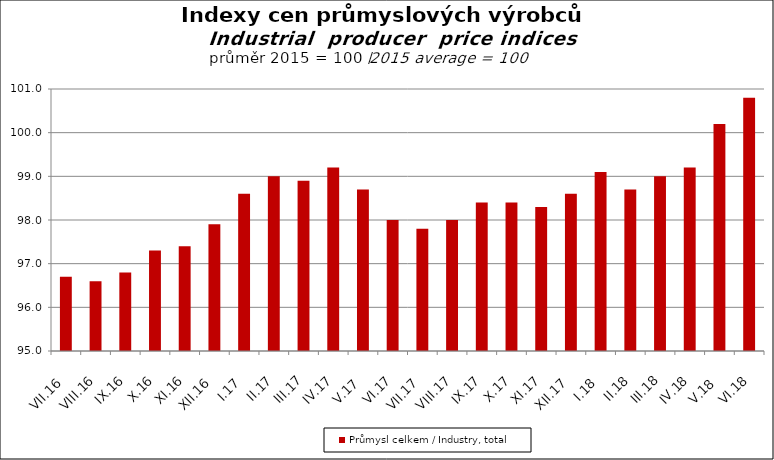
| Category | Průmysl celkem / Industry, total |
|---|---|
| VII.16 | 96.7 |
| VIII.16 | 96.6 |
| IX.16 | 96.8 |
| X.16 | 97.3 |
| XI.16 | 97.4 |
| XII.16 | 97.9 |
| I.17 | 98.6 |
| II.17 | 99 |
| III.17 | 98.9 |
| IV.17 | 99.2 |
| V.17 | 98.7 |
| VI.17 | 98 |
| VII.17 | 97.8 |
| VIII.17 | 98 |
| IX.17 | 98.4 |
| X.17 | 98.4 |
| XI.17 | 98.3 |
| XII.17 | 98.6 |
| I.18 | 99.1 |
| II.18 | 98.7 |
| III.18 | 99 |
| IV.18 | 99.2 |
| V.18 | 100.2 |
| VI.18 | 100.8 |